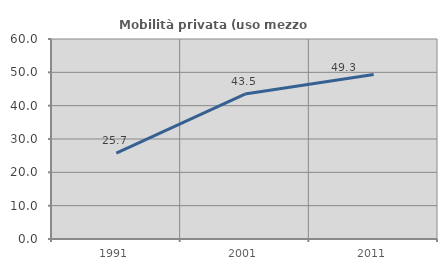
| Category | Mobilità privata (uso mezzo privato) |
|---|---|
| 1991.0 | 25.74 |
| 2001.0 | 43.472 |
| 2011.0 | 49.334 |